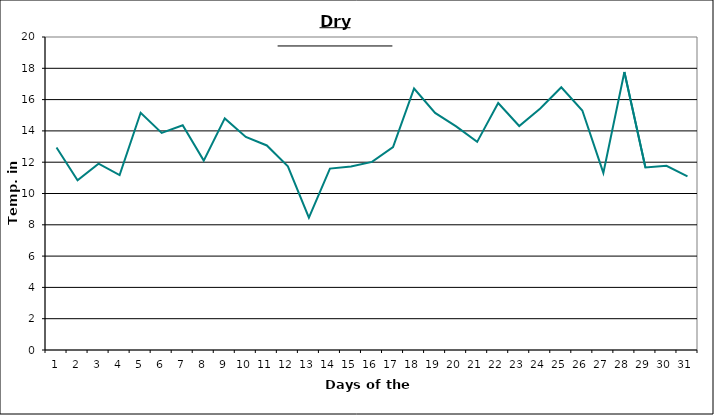
| Category | Series 0 |
|---|---|
| 0 | 12.94 |
| 1 | 10.85 |
| 2 | 11.91 |
| 3 | 11.18 |
| 4 | 15.16 |
| 5 | 13.87 |
| 6 | 14.36 |
| 7 | 12.1 |
| 8 | 14.8 |
| 9 | 13.61 |
| 10 | 13.07 |
| 11 | 11.74 |
| 12 | 8.46 |
| 13 | 11.59 |
| 14 | 11.73 |
| 15 | 12.02 |
| 16 | 12.96 |
| 17 | 16.71 |
| 18 | 15.15 |
| 19 | 14.29 |
| 20 | 13.3 |
| 21 | 15.78 |
| 22 | 14.31 |
| 23 | 15.43 |
| 24 | 16.79 |
| 25 | 15.3 |
| 26 | 11.32 |
| 27 | 17.76 |
| 28 | 11.66 |
| 29 | 11.77 |
| 30 | 11.09 |